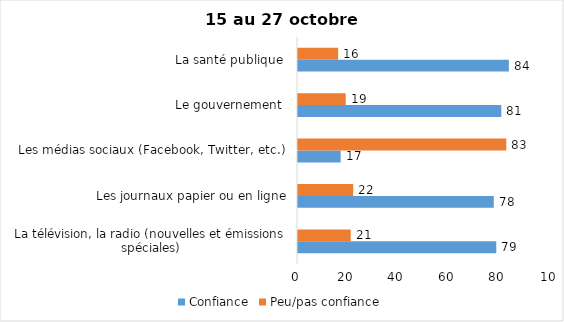
| Category | Confiance | Peu/pas confiance |
|---|---|---|
| La télévision, la radio (nouvelles et émissions spéciales) | 79 | 21 |
| Les journaux papier ou en ligne | 78 | 22 |
| Les médias sociaux (Facebook, Twitter, etc.) | 17 | 83 |
| Le gouvernement  | 81 | 19 |
| La santé publique  | 84 | 16 |